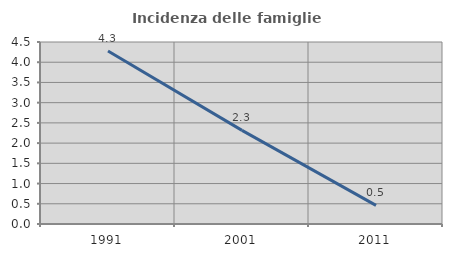
| Category | Incidenza delle famiglie numerose |
|---|---|
| 1991.0 | 4.279 |
| 2001.0 | 2.315 |
| 2011.0 | 0.46 |